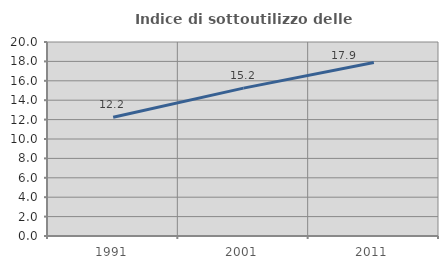
| Category | Indice di sottoutilizzo delle abitazioni  |
|---|---|
| 1991.0 | 12.247 |
| 2001.0 | 15.248 |
| 2011.0 | 17.892 |